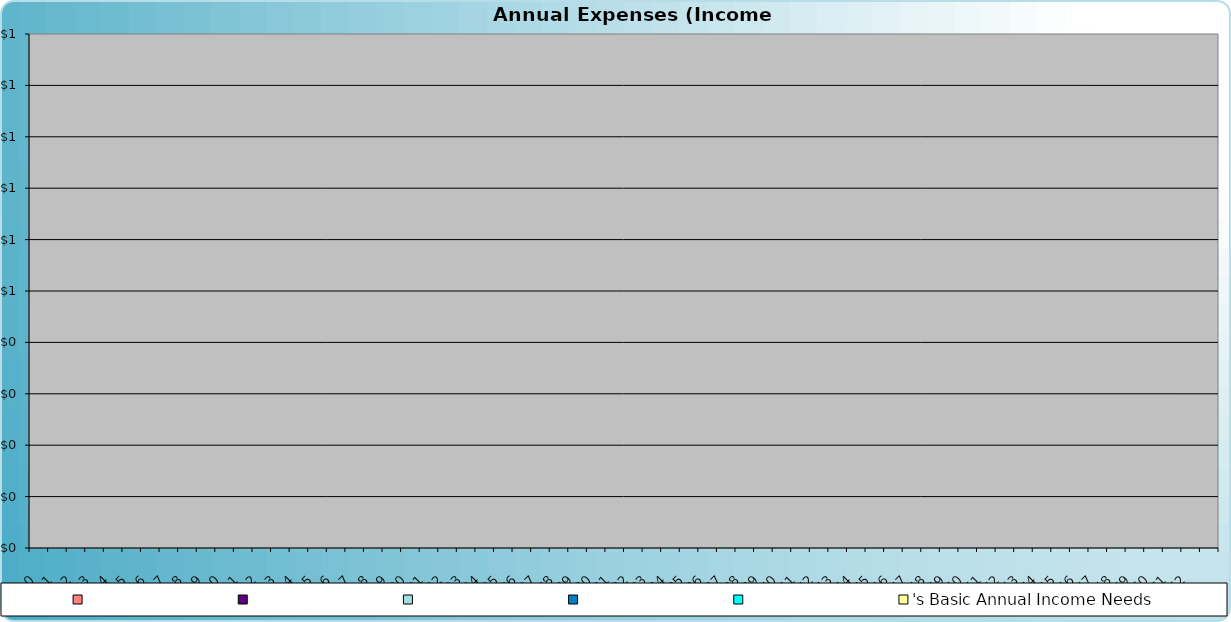
| Category | 's Basic Annual Income Needs |   |
|---|---|---|
| 0.0 | 0 | 0 |
| 1.0 | 0 | 0 |
| 2.0 | 0 | 0 |
| 3.0 | 0 | 0 |
| 4.0 | 0 | 0 |
| 5.0 | 0 | 0 |
| 6.0 | 0 | 0 |
| 7.0 | 0 | 0 |
| 8.0 | 0 | 0 |
| 9.0 | 0 | 0 |
| 10.0 | 0 | 0 |
| 11.0 | 0 | 0 |
| 12.0 | 0 | 0 |
| 13.0 | 0 | 0 |
| 14.0 | 0 | 0 |
| 15.0 | 0 | 0 |
| 16.0 | 0 | 0 |
| 17.0 | 0 | 0 |
| 18.0 | 0 | 0 |
| 19.0 | 0 | 0 |
| 20.0 | 0 | 0 |
| 21.0 | 0 | 0 |
| 22.0 | 0 | 0 |
| 23.0 | 0 | 0 |
| 24.0 | 0 | 0 |
| 25.0 | 0 | 0 |
| 26.0 | 0 | 0 |
| 27.0 | 0 | 0 |
| 28.0 | 0 | 0 |
| 29.0 | 0 | 0 |
| 30.0 | 0 | 0 |
| 31.0 | 0 | 0 |
| 32.0 | 0 | 0 |
| 33.0 | 0 | 0 |
| 34.0 | 0 | 0 |
| 35.0 | 0 | 0 |
| 36.0 | 0 | 0 |
| 37.0 | 0 | 0 |
| 38.0 | 0 | 0 |
| 39.0 | 0 | 0 |
| 40.0 | 0 | 0 |
| 41.0 | 0 | 0 |
| 42.0 | 0 | 0 |
| 43.0 | 0 | 0 |
| 44.0 | 0 | 0 |
| 45.0 | 0 | 0 |
| 46.0 | 0 | 0 |
| 47.0 | 0 | 0 |
| 48.0 | 0 | 0 |
| 49.0 | 0 | 0 |
| 50.0 | 0 | 0 |
| 51.0 | 0 | 0 |
| 52.0 | 0 | 0 |
| 53.0 | 0 | 0 |
| 54.0 | 0 | 0 |
| 55.0 | 0 | 0 |
| 56.0 | 0 | 0 |
| 57.0 | 0 | 0 |
| 58.0 | 0 | 0 |
| 59.0 | 0 | 0 |
| 60.0 | 0 | 0 |
| 61.0 | 0 | 0 |
| 62.0 | 0 | 0 |